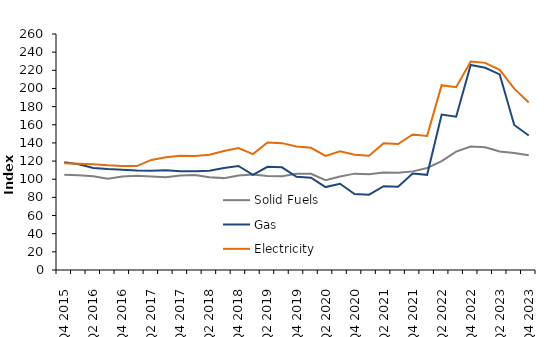
| Category | Solid Fuels | Gas | Electricity |
|---|---|---|---|
| Q4 2015 | 104.998 | 118.757 | 117.735 |
| Q1 2016 | 104.436 | 116.552 | 117.105 |
| Q2 2016 | 103.17 | 112.327 | 116.497 |
| Q3 2016 | 100.651 | 111.259 | 115.39 |
| Q4 2016 | 103.076 | 110.559 | 114.663 |
| Q1 2017 | 103.755 | 109.51 | 114.523 |
| Q2 2017 | 102.943 | 109.274 | 121.273 |
| Q3 2017 | 102.127 | 109.867 | 124.232 |
| Q4 2017 | 104.088 | 108.846 | 125.794 |
| Q1 2018 | 104.775 | 108.854 | 125.535 |
| Q2 2018 | 102.239 | 109.458 | 126.897 |
| Q3 2018 | 101.223 | 112.468 | 131.166 |
| Q4 2018 | 104.039 | 114.642 | 134.316 |
| Q1 2019 | 105.21 | 104.83 | 127.649 |
| Q2 2019 | 103.588 | 113.721 | 140.463 |
| Q3 2019 | 103.265 | 113.154 | 139.763 |
| Q4 2019 | 106.022 | 102.632 | 135.999 |
| Q1 2020 | 106.03 | 101.625 | 134.664 |
| Q2 2020 | 99.027 | 91.355 | 125.633 |
| Q3 2020 | 103.079 | 94.985 | 130.669 |
| Q4 2020 | 106.164 | 83.699 | 126.876 |
| Q1 2021 | 105.535 | 82.986 | 125.794 |
| Q2 2021 | 107.449 | 92.278 | 139.562 |
| Q3 2021 | 107.009 | 91.66 | 138.838 |
| Q4 2021 | 108.653 | 106.198 | 149.317 |
| Q1 2022 | 112.389 | 104.817 | 147.739 |
| Q2 2022 | 119.899 | 171.251 | 203.577 |
| Q3 2022 | 130.483 | 168.834 | 201.35 |
| Q4 2022 | 135.959 | 225.858 | 229.713 |
| Q1 2023 | 135.204 | 222.734 | 228.206 |
| Q2 2023 | 130.562 | 215.461 | 220.595 |
| Q3 2023 | 128.817 | 159.746 | 199.837 |
| Q4 2023 | 126.408 | 148.243 | 184.566 |